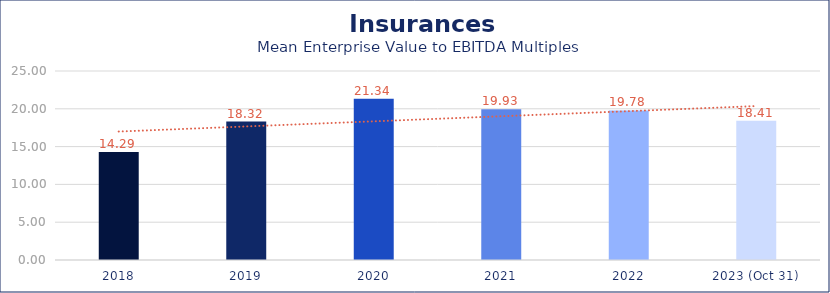
| Category | Insurances |
|---|---|
| 2018 | 14.29 |
| 2019 | 18.32 |
| 2020 | 21.34 |
| 2021 | 19.93 |
| 2022 | 19.78 |
| 2023 (Oct 31) | 18.41 |